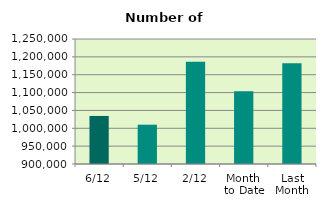
| Category | Series 0 |
|---|---|
| 6/12 | 1034562 |
| 5/12 | 1010054 |
| 2/12 | 1186002 |
| Month 
to Date | 1103395 |
| Last
Month | 1182027.273 |